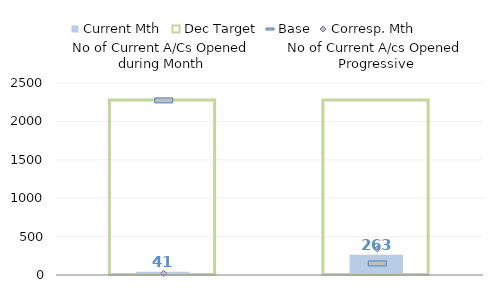
| Category | Current Mth |
|---|---|
| No of Current A/Cs Opened during Month | 41 |
| No of Current A/cs Opened Progressive | 263 |